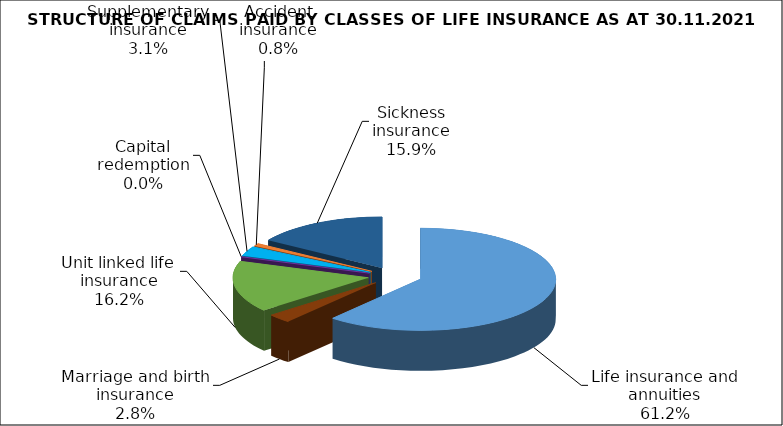
| Category | Series 0 |
|---|---|
| Life insurance and annuities | 123990525.459 |
| Marriage and birth insurance | 5752021.969 |
| Unit linked life insurance | 32875751.767 |
| Capital redemption | 0 |
| Supplementary insurance | 6247842.2 |
| Accident insurance | 1640704.317 |
| Sickness insurance | 32194067.71 |